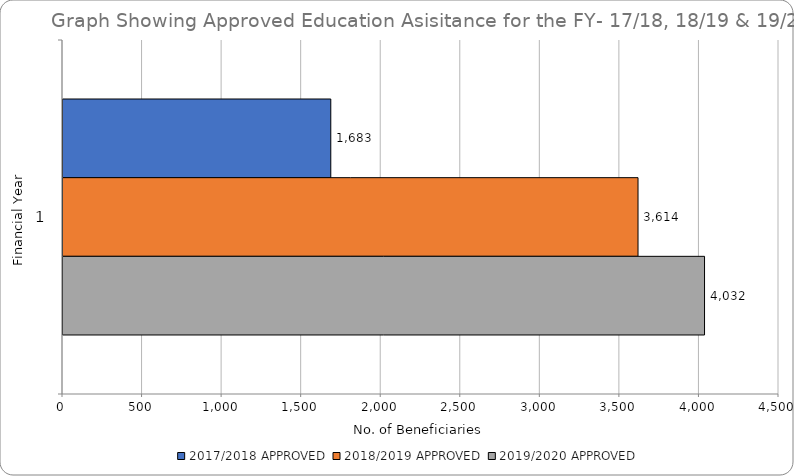
| Category | 2017/2018 APPROVED | 2018/2019 APPROVED | 2019/2020 APPROVED |
|---|---|---|---|
| 0 | 1683 | 3614 | 4032 |